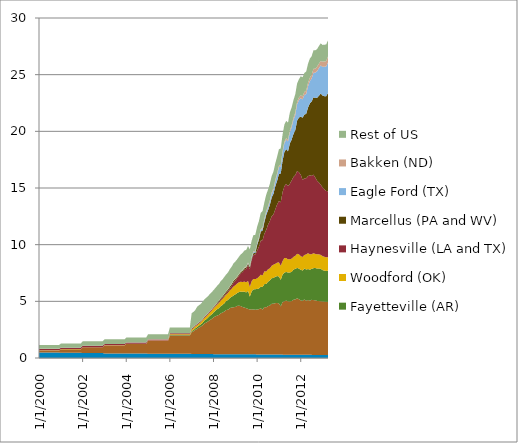
| Category | Antrim (MI, IN, and OH) | Barnett (TX) | Fayetteville (AR) | Woodford (OK) | Haynesville (LA and TX) | Marcellus (PA and WV) | Eagle Ford (TX) | Bakken (ND) | Rest of US |
|---|---|---|---|---|---|---|---|---|---|
| 1/1/00 | 0.481 | 0.184 | 0 | 0.009 | 0.128 | 0.001 | 0 | 0.005 | 0.332 |
| 2/1/00 | 0.481 | 0.184 | 0 | 0.009 | 0.128 | 0.001 | 0 | 0.005 | 0.332 |
| 3/1/00 | 0.481 | 0.184 | 0 | 0.009 | 0.128 | 0.001 | 0 | 0.005 | 0.332 |
| 4/1/00 | 0.481 | 0.184 | 0 | 0.009 | 0.128 | 0.001 | 0 | 0.005 | 0.332 |
| 5/1/00 | 0.481 | 0.184 | 0 | 0.009 | 0.128 | 0.001 | 0 | 0.005 | 0.332 |
| 6/1/00 | 0.481 | 0.184 | 0 | 0.009 | 0.128 | 0.001 | 0 | 0.005 | 0.332 |
| 7/1/00 | 0.481 | 0.184 | 0 | 0.009 | 0.128 | 0.001 | 0 | 0.005 | 0.332 |
| 8/1/00 | 0.481 | 0.184 | 0 | 0.009 | 0.128 | 0.001 | 0 | 0.005 | 0.332 |
| 9/1/00 | 0.481 | 0.184 | 0 | 0.009 | 0.128 | 0.001 | 0 | 0.005 | 0.332 |
| 10/1/00 | 0.481 | 0.184 | 0 | 0.009 | 0.128 | 0.001 | 0 | 0.005 | 0.332 |
| 11/1/00 | 0.481 | 0.184 | 0 | 0.009 | 0.128 | 0.001 | 0 | 0.005 | 0.332 |
| 12/1/00 | 0.481 | 0.184 | 0 | 0.009 | 0.128 | 0.001 | 0 | 0.005 | 0.332 |
| 1/1/01 | 0.461 | 0.314 | 0 | 0.009 | 0.125 | 0.001 | 0 | 0.005 | 0.359 |
| 2/1/01 | 0.461 | 0.314 | 0 | 0.009 | 0.125 | 0.001 | 0 | 0.005 | 0.359 |
| 3/1/01 | 0.461 | 0.314 | 0 | 0.009 | 0.125 | 0.001 | 0 | 0.005 | 0.359 |
| 4/1/01 | 0.461 | 0.314 | 0 | 0.009 | 0.125 | 0.001 | 0 | 0.005 | 0.359 |
| 5/1/01 | 0.461 | 0.314 | 0 | 0.009 | 0.125 | 0.001 | 0 | 0.005 | 0.359 |
| 6/1/01 | 0.461 | 0.314 | 0 | 0.009 | 0.125 | 0.001 | 0 | 0.005 | 0.359 |
| 7/1/01 | 0.461 | 0.314 | 0 | 0.009 | 0.125 | 0.001 | 0 | 0.005 | 0.359 |
| 8/1/01 | 0.461 | 0.314 | 0 | 0.009 | 0.125 | 0.001 | 0 | 0.005 | 0.359 |
| 9/1/01 | 0.461 | 0.314 | 0 | 0.009 | 0.125 | 0.001 | 0 | 0.005 | 0.359 |
| 10/1/01 | 0.461 | 0.314 | 0 | 0.009 | 0.125 | 0.001 | 0 | 0.005 | 0.359 |
| 11/1/01 | 0.461 | 0.314 | 0 | 0.009 | 0.125 | 0.001 | 0 | 0.005 | 0.359 |
| 12/1/01 | 0.461 | 0.314 | 0 | 0.009 | 0.125 | 0.001 | 0 | 0.005 | 0.359 |
| 1/1/02 | 0.438 | 0.508 | 0 | 0.009 | 0.121 | 0 | 0 | 0.004 | 0.39 |
| 2/1/02 | 0.438 | 0.508 | 0 | 0.009 | 0.121 | 0 | 0 | 0.004 | 0.39 |
| 3/1/02 | 0.438 | 0.508 | 0 | 0.009 | 0.121 | 0 | 0 | 0.004 | 0.39 |
| 4/1/02 | 0.438 | 0.508 | 0 | 0.009 | 0.121 | 0 | 0 | 0.004 | 0.39 |
| 5/1/02 | 0.438 | 0.508 | 0 | 0.009 | 0.121 | 0 | 0 | 0.004 | 0.39 |
| 6/1/02 | 0.438 | 0.508 | 0 | 0.009 | 0.121 | 0 | 0 | 0.004 | 0.39 |
| 7/1/02 | 0.438 | 0.508 | 0 | 0.009 | 0.121 | 0 | 0 | 0.004 | 0.39 |
| 8/1/02 | 0.438 | 0.508 | 0 | 0.009 | 0.121 | 0 | 0 | 0.004 | 0.39 |
| 9/1/02 | 0.438 | 0.508 | 0 | 0.009 | 0.121 | 0 | 0 | 0.004 | 0.39 |
| 10/1/02 | 0.438 | 0.508 | 0 | 0.009 | 0.121 | 0 | 0 | 0.004 | 0.39 |
| 11/1/02 | 0.438 | 0.508 | 0 | 0.009 | 0.121 | 0 | 0 | 0.004 | 0.39 |
| 12/1/02 | 0.438 | 0.508 | 0 | 0.009 | 0.121 | 0 | 0 | 0.004 | 0.39 |
| 1/1/03 | 0.405 | 0.706 | 0 | 0.01 | 0.106 | 0 | 0 | 0.004 | 0.414 |
| 2/1/03 | 0.405 | 0.706 | 0 | 0.01 | 0.106 | 0 | 0 | 0.004 | 0.414 |
| 3/1/03 | 0.405 | 0.706 | 0 | 0.01 | 0.106 | 0 | 0 | 0.004 | 0.414 |
| 4/1/03 | 0.405 | 0.706 | 0 | 0.01 | 0.106 | 0 | 0 | 0.004 | 0.414 |
| 5/1/03 | 0.405 | 0.706 | 0 | 0.01 | 0.106 | 0 | 0 | 0.004 | 0.414 |
| 6/1/03 | 0.405 | 0.706 | 0 | 0.01 | 0.106 | 0 | 0 | 0.004 | 0.414 |
| 7/1/03 | 0.405 | 0.706 | 0 | 0.01 | 0.106 | 0 | 0 | 0.004 | 0.414 |
| 8/1/03 | 0.405 | 0.706 | 0 | 0.01 | 0.106 | 0 | 0 | 0.004 | 0.414 |
| 9/1/03 | 0.405 | 0.706 | 0 | 0.01 | 0.106 | 0 | 0 | 0.004 | 0.414 |
| 10/1/03 | 0.405 | 0.706 | 0 | 0.01 | 0.106 | 0 | 0 | 0.004 | 0.414 |
| 11/1/03 | 0.405 | 0.706 | 0 | 0.01 | 0.106 | 0 | 0 | 0.004 | 0.414 |
| 12/1/03 | 0.405 | 0.706 | 0 | 0.01 | 0.106 | 0 | 0 | 0.004 | 0.414 |
| 1/1/04 | 0.391 | 0.857 | 0 | 0.015 | 0.097 | 0 | 0 | 0.004 | 0.437 |
| 2/1/04 | 0.391 | 0.857 | 0 | 0.015 | 0.097 | 0 | 0 | 0.004 | 0.437 |
| 3/1/04 | 0.391 | 0.857 | 0 | 0.015 | 0.097 | 0 | 0 | 0.004 | 0.437 |
| 4/1/04 | 0.391 | 0.857 | 0 | 0.015 | 0.097 | 0 | 0 | 0.004 | 0.437 |
| 5/1/04 | 0.391 | 0.857 | 0 | 0.015 | 0.097 | 0 | 0 | 0.004 | 0.437 |
| 6/1/04 | 0.391 | 0.857 | 0 | 0.015 | 0.097 | 0 | 0 | 0.004 | 0.437 |
| 7/1/04 | 0.391 | 0.857 | 0 | 0.015 | 0.097 | 0 | 0 | 0.004 | 0.437 |
| 8/1/04 | 0.391 | 0.857 | 0 | 0.015 | 0.097 | 0 | 0 | 0.004 | 0.437 |
| 9/1/04 | 0.391 | 0.857 | 0 | 0.015 | 0.097 | 0 | 0 | 0.004 | 0.437 |
| 10/1/04 | 0.391 | 0.857 | 0 | 0.015 | 0.097 | 0 | 0 | 0.004 | 0.437 |
| 11/1/04 | 0.391 | 0.857 | 0 | 0.015 | 0.097 | 0 | 0 | 0.004 | 0.437 |
| 12/1/04 | 0.391 | 0.857 | 0 | 0.015 | 0.097 | 0 | 0 | 0.004 | 0.437 |
| 1/1/05 | 0.381 | 1.134 | 0.006 | 0.025 | 0.091 | 0.002 | 0 | 0.005 | 0.459 |
| 2/1/05 | 0.381 | 1.134 | 0.006 | 0.025 | 0.091 | 0.002 | 0 | 0.005 | 0.459 |
| 3/1/05 | 0.381 | 1.134 | 0.006 | 0.025 | 0.091 | 0.002 | 0 | 0.005 | 0.459 |
| 4/1/05 | 0.381 | 1.134 | 0.006 | 0.025 | 0.091 | 0.002 | 0 | 0.005 | 0.459 |
| 5/1/05 | 0.381 | 1.134 | 0.006 | 0.025 | 0.091 | 0.002 | 0 | 0.005 | 0.459 |
| 6/1/05 | 0.381 | 1.134 | 0.006 | 0.025 | 0.091 | 0.002 | 0 | 0.005 | 0.459 |
| 7/1/05 | 0.381 | 1.134 | 0.006 | 0.025 | 0.091 | 0.002 | 0 | 0.005 | 0.459 |
| 8/1/05 | 0.381 | 1.134 | 0.006 | 0.025 | 0.091 | 0.002 | 0 | 0.005 | 0.459 |
| 9/1/05 | 0.381 | 1.134 | 0.006 | 0.025 | 0.091 | 0.002 | 0 | 0.005 | 0.459 |
| 10/1/05 | 0.381 | 1.134 | 0.006 | 0.025 | 0.091 | 0.002 | 0 | 0.005 | 0.459 |
| 11/1/05 | 0.381 | 1.134 | 0.006 | 0.025 | 0.091 | 0.002 | 0 | 0.005 | 0.459 |
| 12/1/05 | 0.381 | 1.134 | 0.006 | 0.025 | 0.091 | 0.002 | 0 | 0.005 | 0.459 |
| 1/1/06 | 0.373 | 1.61 | 0.04 | 0.071 | 0.082 | 0.012 | 0 | 0.007 | 0.506 |
| 2/1/06 | 0.373 | 1.61 | 0.04 | 0.071 | 0.082 | 0.012 | 0 | 0.007 | 0.506 |
| 3/1/06 | 0.373 | 1.61 | 0.04 | 0.071 | 0.082 | 0.012 | 0 | 0.007 | 0.506 |
| 4/1/06 | 0.373 | 1.61 | 0.04 | 0.071 | 0.082 | 0.012 | 0 | 0.007 | 0.506 |
| 5/1/06 | 0.373 | 1.61 | 0.04 | 0.071 | 0.082 | 0.012 | 0 | 0.007 | 0.506 |
| 6/1/06 | 0.373 | 1.61 | 0.04 | 0.071 | 0.082 | 0.012 | 0 | 0.007 | 0.506 |
| 7/1/06 | 0.373 | 1.61 | 0.04 | 0.071 | 0.082 | 0.012 | 0 | 0.007 | 0.506 |
| 8/1/06 | 0.373 | 1.61 | 0.04 | 0.071 | 0.082 | 0.012 | 0 | 0.007 | 0.506 |
| 9/1/06 | 0.373 | 1.61 | 0.04 | 0.071 | 0.082 | 0.012 | 0 | 0.007 | 0.506 |
| 10/1/06 | 0.373 | 1.61 | 0.04 | 0.071 | 0.082 | 0.012 | 0 | 0.007 | 0.506 |
| 11/1/06 | 0.373 | 1.61 | 0.04 | 0.071 | 0.082 | 0.012 | 0 | 0.007 | 0.506 |
| 12/1/06 | 0.373 | 1.61 | 0.04 | 0.071 | 0.082 | 0.012 | 0 | 0.007 | 0.506 |
| 1/1/07 | 0.362 | 1.921 | 0.099 | 0.131 | 0.081 | 0.02 | 0 | 0.009 | 1.336 |
| 2/1/07 | 0.362 | 1.999 | 0.115 | 0.146 | 0.081 | 0.022 | 0 | 0.009 | 1.336 |
| 3/1/07 | 0.362 | 2.123 | 0.138 | 0.166 | 0.079 | 0.023 | 0 | 0.009 | 1.336 |
| 4/1/07 | 0.363 | 2.208 | 0.157 | 0.176 | 0.077 | 0.024 | 0 | 0.013 | 1.501 |
| 5/1/07 | 0.363 | 2.33 | 0.171 | 0.173 | 0.078 | 0.024 | 0 | 0.013 | 1.501 |
| 6/1/07 | 0.363 | 2.41 | 0.193 | 0.189 | 0.078 | 0.026 | 0 | 0.013 | 1.501 |
| 7/1/07 | 0.36 | 2.523 | 0.227 | 0.21 | 0.077 | 0.026 | 0 | 0.016 | 1.515 |
| 8/1/07 | 0.36 | 2.692 | 0.26 | 0.231 | 0.078 | 0.025 | 0 | 0.016 | 1.515 |
| 9/1/07 | 0.36 | 2.769 | 0.288 | 0.257 | 0.08 | 0.029 | 0 | 0.016 | 1.515 |
| 10/1/07 | 0.358 | 2.869 | 0.329 | 0.283 | 0.081 | 0.031 | 0 | 0.019 | 1.49 |
| 11/1/07 | 0.358 | 2.989 | 0.376 | 0.296 | 0.081 | 0.034 | 0 | 0.019 | 1.49 |
| 12/1/07 | 0.358 | 3.086 | 0.405 | 0.322 | 0.081 | 0.036 | 0 | 0.019 | 1.49 |
| 1/1/08 | 0.338 | 3.24 | 0.436 | 0.352 | 0.085 | 0.036 | 0 | 0.015 | 1.482 |
| 2/1/08 | 0.338 | 3.337 | 0.493 | 0.366 | 0.083 | 0.057 | 0 | 0.015 | 1.482 |
| 3/1/08 | 0.338 | 3.406 | 0.564 | 0.398 | 0.084 | 0.077 | 0 | 0.015 | 1.482 |
| 4/1/08 | 0.337 | 3.468 | 0.598 | 0.443 | 0.096 | 0.09 | 0.001 | 0.022 | 1.479 |
| 5/1/08 | 0.337 | 3.607 | 0.633 | 0.494 | 0.102 | 0.109 | 0.001 | 0.022 | 1.479 |
| 6/1/08 | 0.337 | 3.672 | 0.683 | 0.528 | 0.103 | 0.117 | 0.002 | 0.022 | 1.479 |
| 7/1/08 | 0.339 | 3.759 | 0.737 | 0.569 | 0.115 | 0.136 | 0 | 0.029 | 1.48 |
| 8/1/08 | 0.339 | 3.906 | 0.791 | 0.561 | 0.128 | 0.14 | 0 | 0.029 | 1.48 |
| 9/1/08 | 0.339 | 3.909 | 0.874 | 0.63 | 0.151 | 0.139 | 0.002 | 0.029 | 1.48 |
| 10/1/08 | 0.333 | 4.071 | 0.902 | 0.66 | 0.183 | 0.148 | 0.004 | 0.037 | 1.5 |
| 11/1/08 | 0.333 | 4.118 | 0.952 | 0.712 | 0.247 | 0.149 | 0.004 | 0.037 | 1.5 |
| 12/1/08 | 0.333 | 4.148 | 1.034 | 0.788 | 0.348 | 0.155 | 0.004 | 0.037 | 1.5 |
| 1/1/09 | 0.326 | 4.176 | 1.109 | 0.81 | 0.402 | 0.134 | 0.005 | 0.039 | 1.508 |
| 2/1/09 | 0.326 | 4.269 | 1.131 | 0.839 | 0.488 | 0.096 | 0.008 | 0.039 | 1.508 |
| 3/1/09 | 0.326 | 4.295 | 1.196 | 0.864 | 0.586 | 0.111 | 0.011 | 0.039 | 1.508 |
| 4/1/09 | 0.327 | 4.252 | 1.282 | 0.866 | 0.739 | 0.115 | 0.014 | 0.048 | 1.498 |
| 5/1/09 | 0.327 | 4.172 | 1.343 | 0.862 | 0.885 | 0.121 | 0.018 | 0.048 | 1.498 |
| 6/1/09 | 0.327 | 4.119 | 1.417 | 0.879 | 1.05 | 0.12 | 0.023 | 0.048 | 1.498 |
| 7/1/09 | 0.331 | 4.065 | 1.384 | 0.899 | 1.19 | 0.122 | 0.031 | 0.058 | 1.46 |
| 8/1/09 | 0.331 | 4.001 | 1.59 | 0.874 | 1.397 | 0.131 | 0.041 | 0.058 | 1.46 |
| 9/1/09 | 0.331 | 3.943 | 1.141 | 0.866 | 1.587 | 0.14 | 0.052 | 0.058 | 1.46 |
| 10/1/09 | 0.323 | 3.971 | 1.585 | 0.912 | 1.864 | 0.145 | 0.075 | 0.062 | 1.426 |
| 11/1/09 | 0.323 | 3.955 | 1.773 | 0.932 | 2.129 | 0.144 | 0.108 | 0.062 | 1.426 |
| 12/1/09 | 0.323 | 3.936 | 1.815 | 0.883 | 2.181 | 0.131 | 0.108 | 0.062 | 1.426 |
| 1/1/10 | 0.312 | 3.963 | 1.811 | 0.943 | 2.444 | 0.474 | 0.118 | 0.08 | 1.434 |
| 2/1/10 | 0.312 | 3.992 | 1.841 | 1.025 | 2.654 | 0.628 | 0.126 | 0.08 | 1.434 |
| 3/1/10 | 0.312 | 4.089 | 1.898 | 1.055 | 3.014 | 0.786 | 0.139 | 0.08 | 1.434 |
| 4/1/10 | 0.308 | 3.953 | 2 | 1.022 | 3.11 | 0.858 | 0.156 | 0.101 | 1.461 |
| 5/1/10 | 0.308 | 4.19 | 2.028 | 1.122 | 3.32 | 1.025 | 0.191 | 0.101 | 1.461 |
| 6/1/10 | 0.308 | 4.162 | 2.071 | 1.097 | 3.667 | 1.309 | 0.234 | 0.101 | 1.461 |
| 7/1/10 | 0.308 | 4.271 | 2.142 | 1.1 | 3.94 | 1.279 | 0.246 | 0.122 | 1.448 |
| 8/1/10 | 0.308 | 4.317 | 2.228 | 1.062 | 4.172 | 1.433 | 0.278 | 0.122 | 1.448 |
| 9/1/10 | 0.308 | 4.469 | 2.259 | 1.097 | 4.374 | 1.647 | 0.323 | 0.122 | 1.448 |
| 10/1/10 | 0.305 | 4.481 | 2.284 | 1.165 | 4.429 | 1.822 | 0.36 | 0.139 | 1.468 |
| 11/1/10 | 0.305 | 4.536 | 2.317 | 1.153 | 4.806 | 2.04 | 0.411 | 0.139 | 1.468 |
| 12/1/10 | 0.305 | 4.551 | 2.378 | 1.174 | 5.143 | 2.074 | 0.536 | 0.139 | 1.468 |
| 1/1/11 | 0.299 | 4.515 | 2.373 | 1.26 | 5.413 | 2.378 | 0.597 | 0.123 | 1.453 |
| 2/1/11 | 0.299 | 4.256 | 2.345 | 1.237 | 5.602 | 2.537 | 0.645 | 0.123 | 1.453 |
| 3/1/11 | 0.299 | 4.644 | 2.412 | 1.202 | 6.08 | 2.78 | 0.722 | 0.123 | 1.453 |
| 4/1/11 | 0.292 | 4.713 | 2.529 | 1.286 | 6.335 | 3.016 | 0.776 | 0.137 | 1.507 |
| 5/1/11 | 0.292 | 4.773 | 2.532 | 1.222 | 6.552 | 3.062 | 0.843 | 0.137 | 1.507 |
| 6/1/11 | 0.292 | 4.71 | 2.536 | 1.169 | 6.47 | 3.062 | 0.884 | 0.137 | 1.507 |
| 7/1/11 | 0.295 | 4.69 | 2.565 | 1.162 | 6.646 | 3.572 | 0.97 | 0.182 | 1.574 |
| 8/1/11 | 0.295 | 4.73 | 2.565 | 1.179 | 6.905 | 3.596 | 1.085 | 0.182 | 1.574 |
| 9/1/11 | 0.295 | 4.842 | 2.661 | 1.125 | 7.049 | 3.791 | 1.245 | 0.182 | 1.574 |
| 10/1/11 | 0.291 | 4.882 | 2.696 | 1.146 | 7.114 | 3.98 | 1.326 | 0.22 | 1.617 |
| 11/1/11 | 0.291 | 4.975 | 2.682 | 1.244 | 7.312 | 4.439 | 1.439 | 0.22 | 1.617 |
| 12/1/11 | 0.291 | 4.897 | 2.702 | 1.263 | 7.229 | 4.829 | 1.55 | 0.22 | 1.617 |
| 1/1/12 | 0.284 | 4.795 | 2.71 | 1.202 | 7.182 | 5.128 | 1.618 | 0.256 | 1.689 |
| 2/1/12 | 0.284 | 4.753 | 2.685 | 1.193 | 6.806 | 5.481 | 1.623 | 0.256 | 1.689 |
| 3/1/12 | 0.284 | 4.881 | 2.722 | 1.195 | 6.76 | 5.64 | 1.729 | 0.256 | 1.689 |
| 4/1/12 | 0.279 | 4.773 | 2.756 | 1.335 | 6.719 | 5.68 | 1.753 | 0.3 | 1.683 |
| 5/1/12 | 0.279 | 4.836 | 2.734 | 1.399 | 6.795 | 6.048 | 1.885 | 0.3 | 1.683 |
| 6/1/12 | 0.279 | 4.78 | 2.737 | 1.355 | 6.969 | 6.347 | 1.962 | 0.3 | 1.683 |
| 7/1/12 | 0.275 | 4.858 | 2.733 | 1.289 | 6.923 | 6.547 | 2.032 | 0.341 | 1.632 |
| 8/1/12 | 0.275 | 4.834 | 2.818 | 1.321 | 6.928 | 6.834 | 2.162 | 0.341 | 1.632 |
| 9/1/12 | 0.275 | 4.821 | 2.846 | 1.244 | 6.736 | 7.018 | 2.237 | 0.341 | 1.632 |
| 10/1/12 | 0.271 | 4.764 | 2.855 | 1.254 | 6.495 | 7.322 | 2.345 | 0.4 | 1.551 |
| 11/1/12 | 0.271 | 4.752 | 2.876 | 1.248 | 6.345 | 7.644 | 2.438 | 0.4 | 1.551 |
| 12/1/12 | 0.271 | 4.734 | 2.865 | 1.238 | 6.18 | 8.042 | 2.482 | 0.4 | 1.551 |
| 1/1/13 | 0.266 | 4.724 | 2.769 | 1.229 | 6.059 | 8.108 | 2.531 | 0.464 | 1.476 |
| 2/1/13 | 0.266 | 4.707 | 2.737 | 1.22 | 5.954 | 8.222 | 2.595 | 0.464 | 1.476 |
| 3/1/13 | 0.266 | 4.7 | 2.715 | 1.209 | 5.849 | 8.365 | 2.628 | 0.464 | 1.476 |
| 4/1/13 | 0.262 | 4.686 | 2.753 | 1.198 | 5.81 | 8.674 | 2.693 | 0.538 | 1.412 |